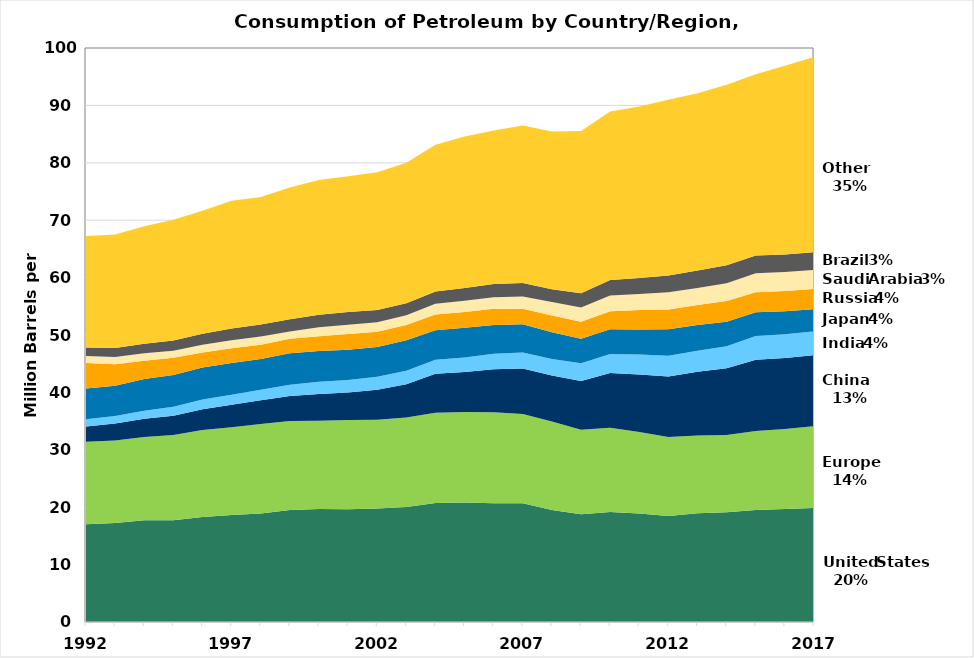
| Category | United States | Europe | China | India | Japan  | Russia | Saudi Arabia | Brazil | Other |
|---|---|---|---|---|---|---|---|---|---|
| 1992.0 | 17.033 | 14.355 | 2.662 | 1.274 | 5.356 | 4.424 | 1.218 | 1.521 | 19.399 |
| 1993.0 | 17.237 | 14.375 | 2.96 | 1.312 | 5.266 | 3.751 | 1.26 | 1.58 | 19.762 |
| 1994.0 | 17.718 | 14.53 | 3.161 | 1.414 | 5.511 | 3.179 | 1.286 | 1.673 | 20.453 |
| 1995.0 | 17.725 | 14.835 | 3.363 | 1.574 | 5.546 | 2.975 | 1.254 | 1.788 | 21.017 |
| 1996.0 | 18.309 | 15.148 | 3.611 | 1.681 | 5.591 | 2.62 | 1.333 | 1.905 | 21.457 |
| 1997.0 | 18.62 | 15.291 | 3.916 | 1.766 | 5.549 | 2.562 | 1.383 | 2.03 | 22.261 |
| 1998.0 | 18.917 | 15.591 | 4.105 | 1.845 | 5.348 | 2.49 | 1.438 | 2.095 | 22.199 |
| 1999.0 | 19.519 | 15.5 | 4.365 | 1.96 | 5.486 | 2.537 | 1.262 | 2.13 | 22.94 |
| 2000.0 | 19.701 | 15.349 | 4.689 | 2.126 | 5.357 | 2.578 | 1.569 | 2.166 | 23.447 |
| 2001.0 | 19.649 | 15.529 | 4.814 | 2.183 | 5.265 | 2.738 | 1.607 | 2.206 | 23.678 |
| 2002.0 | 19.761 | 15.488 | 5.212 | 2.264 | 5.187 | 2.636 | 1.657 | 2.131 | 24.025 |
| 2003.0 | 20.034 | 15.612 | 5.786 | 2.347 | 5.298 | 2.682 | 1.7 | 2.056 | 24.5 |
| 2004.0 | 20.731 | 15.714 | 6.803 | 2.429 | 5.163 | 2.75 | 1.852 | 2.123 | 25.591 |
| 2005.0 | 20.802 | 15.794 | 6.97 | 2.513 | 5.164 | 2.785 | 1.937 | 2.207 | 26.413 |
| 2006.0 | 20.687 | 15.84 | 7.493 | 2.691 | 5.038 | 2.803 | 2.03 | 2.286 | 26.776 |
| 2007.0 | 20.68 | 15.568 | 7.923 | 2.799 | 4.904 | 2.697 | 2.116 | 2.355 | 27.451 |
| 2008.0 | 19.498 | 15.423 | 8.041 | 2.865 | 4.667 | 2.907 | 2.352 | 2.204 | 27.507 |
| 2009.0 | 18.771 | 14.701 | 8.497 | 3.114 | 4.266 | 2.952 | 2.473 | 2.481 | 28.275 |
| 2010.0 | 19.18 | 14.667 | 9.527 | 3.306 | 4.34 | 3.135 | 2.716 | 2.699 | 29.388 |
| 2011.0 | 18.887 | 14.196 | 10.053 | 3.463 | 4.353 | 3.423 | 2.785 | 2.776 | 29.874 |
| 2012.0 | 18.487 | 13.726 | 10.55 | 3.618 | 4.631 | 3.444 | 2.98 | 2.924 | 30.616 |
| 2013.0 | 18.967 | 13.542 | 11.084 | 3.655 | 4.487 | 3.49 | 2.964 | 3.033 | 30.895 |
| 2014.0 | 19.1 | 13.465 | 11.637 | 3.834 | 4.261 | 3.615 | 3.086 | 3.157 | 31.447 |
| 2015.0 | 19.534 | 13.762 | 12.376 | 4.142 | 4.142 | 3.512 | 3.302 | 3.087 | 31.57 |
| 2016.0 | 19.687 | 13.925 | 12.376 | 4.142 | 4.01 | 3.512 | 3.302 | 3.087 | 32.873 |
| 2017.0 | 19.877 | 14.225 | 12.376 | 4.142 | 3.894 | 3.512 | 3.302 | 3.087 | 34.029 |